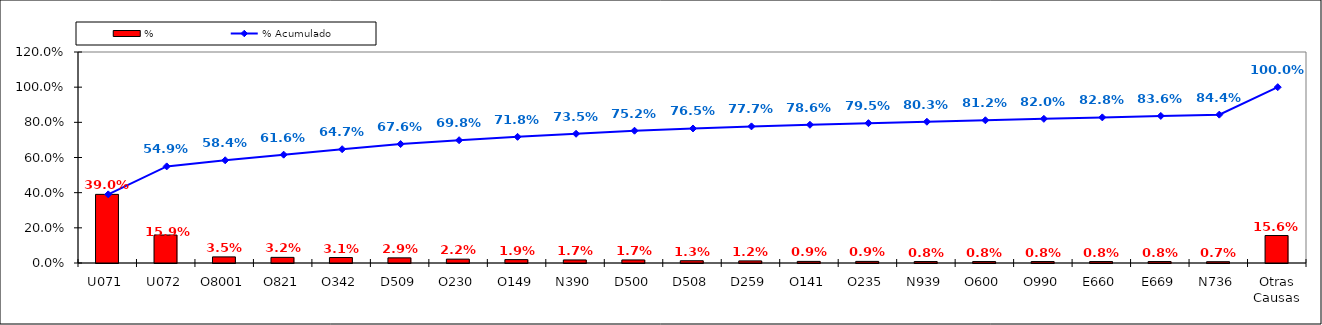
| Category | % |
|---|---|
| U071 | 0.39 |
| U072 | 0.159 |
| O8001 | 0.035 |
| O821 | 0.032 |
| O342 | 0.031 |
| D509 | 0.029 |
| O230 | 0.022 |
| O149 | 0.019 |
| N390 | 0.017 |
| D500 | 0.017 |
| D508 | 0.013 |
| D259 | 0.012 |
| O141 | 0.009 |
| O235 | 0.009 |
| N939 | 0.008 |
| O600 | 0.008 |
| O990 | 0.008 |
| E660 | 0.008 |
| E669 | 0.008 |
| N736 | 0.007 |
| Otras Causas | 0.156 |